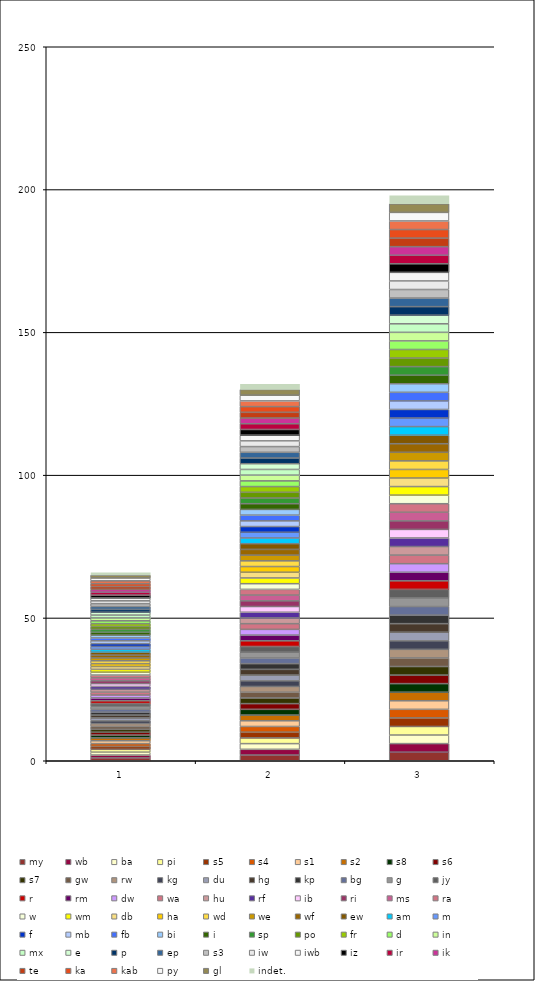
| Category | my | wb | ba | pi | s5 | s4 | s1 | s2 | s8 | s6 | s7 | gw | rw | kg | du | hg | kp | bg | g | jy | r | rm | dw | wa | hu | rf | ib | ri | ms | ra | w | wm | db | ha | wd | we | wf | ew | am | m | f | mb | fb | bi | i | sp | po | fr | d | in | mx | e | p | ep | s3 | iw | iwb | iz | ir | ik | te | ka | kab | py | gl | indet. |
|---|---|---|---|---|---|---|---|---|---|---|---|---|---|---|---|---|---|---|---|---|---|---|---|---|---|---|---|---|---|---|---|---|---|---|---|---|---|---|---|---|---|---|---|---|---|---|---|---|---|---|---|---|---|---|---|---|---|---|---|---|---|---|---|---|---|---|
| 0 | 1 | 1 | 1 | 1 | 1 | 1 | 1 | 1 | 1 | 1 | 1 | 1 | 1 | 1 | 1 | 1 | 1 | 1 | 1 | 1 | 1 | 1 | 1 | 1 | 1 | 1 | 1 | 1 | 1 | 1 | 1 | 1 | 1 | 1 | 1 | 1 | 1 | 1 | 1 | 1 | 1 | 1 | 1 | 1 | 1 | 1 | 1 | 1 | 1 | 1 | 1 | 1 | 1 | 1 | 1 | 1 | 1 | 1 | 1 | 1 | 1 | 1 | 1 | 1 | 1 | 1 |
| 1 | 2 | 2 | 2 | 2 | 2 | 2 | 2 | 2 | 2 | 2 | 2 | 2 | 2 | 2 | 2 | 2 | 2 | 2 | 2 | 2 | 2 | 2 | 2 | 2 | 2 | 2 | 2 | 2 | 2 | 2 | 2 | 2 | 2 | 2 | 2 | 2 | 2 | 2 | 2 | 2 | 2 | 2 | 2 | 2 | 2 | 2 | 2 | 2 | 2 | 2 | 2 | 2 | 2 | 2 | 2 | 2 | 2 | 2 | 2 | 2 | 2 | 2 | 2 | 2 | 2 | 2 |
| 2 | 3 | 3 | 3 | 3 | 3 | 3 | 3 | 3 | 3 | 3 | 3 | 3 | 3 | 3 | 3 | 3 | 3 | 3 | 3 | 3 | 3 | 3 | 3 | 3 | 3 | 3 | 3 | 3 | 3 | 3 | 3 | 3 | 3 | 3 | 3 | 3 | 3 | 3 | 3 | 3 | 3 | 3 | 3 | 3 | 3 | 3 | 3 | 3 | 3 | 3 | 3 | 3 | 3 | 3 | 3 | 3 | 3 | 3 | 3 | 3 | 3 | 3 | 3 | 3 | 3 | 3 |